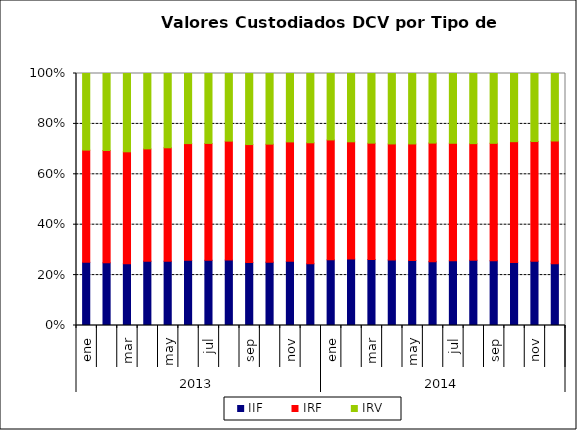
| Category | IIF | IRF | IRV |
|---|---|---|---|
| 0 | 1680.741 | 2988.322 | 2040.209 |
| 1 | 1658.527 | 2973.343 | 2039.052 |
| 2 | 1630.445 | 2958.264 | 2068.804 |
| 3 | 1721.394 | 3005.99 | 2017.792 |
| 4 | 1713.796 | 3025.801 | 1981.652 |
| 5 | 1717.891 | 3073.578 | 1846.579 |
| 6 | 1710.542 | 3066.278 | 1834.309 |
| 7 | 1701.992 | 3092.176 | 1758.669 |
| 8 | 1661.332 | 3111.813 | 1874.421 |
| 9 | 1668.117 | 3106.907 | 1859.962 |
| 10 | 1680.246 | 3124.482 | 1790.218 |
| 11 | 1586.068 | 3111.888 | 1781.214 |
| 12 | 1691.285 | 3088.889 | 1711.633 |
| 13 | 1737.916 | 3069.015 | 1787.756 |
| 14 | 1720.613 | 3030.48 | 1814.882 |
| 15 | 1715.08 | 3037.042 | 1843.591 |
| 16 | 1707.126 | 3061.532 | 1850.323 |
| 17 | 1666.997 | 3095.162 | 1817.341 |
| 18 | 1708.543 | 3102.489 | 1842.196 |
| 19 | 1741.424 | 3115.318 | 1872.893 |
| 20 | 1737.987 | 3149.863 | 1873.636 |
| 21 | 1691.624 | 3252.67 | 1834.205 |
| 22 | 1762.551 | 3275.72 | 1863.237 |
| 23 | 1653.415 | 3289.364 | 1808.275 |